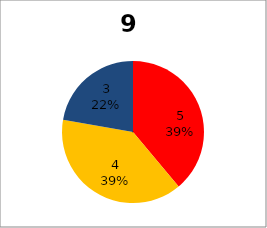
| Category | Series 0 |
|---|---|
| 5.0 | 7 |
| 4.0 | 7 |
| 3.0 | 4 |